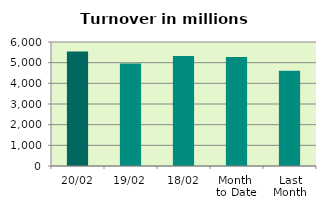
| Category | Series 0 |
|---|---|
| 20/02 | 5544.568 |
| 19/02 | 4958.667 |
| 18/02 | 5317.545 |
| Month 
to Date | 5275.209 |
| Last
Month | 4609.616 |